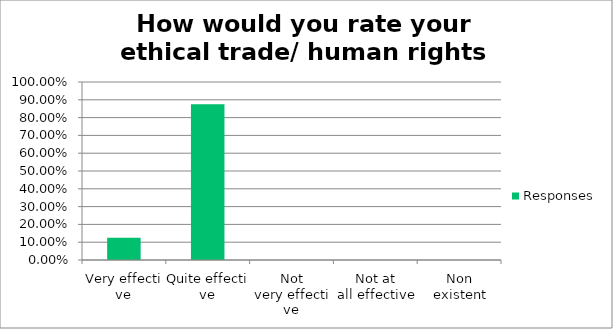
| Category | Responses |
|---|---|
| Very effective | 0.125 |
| Quite effective | 0.875 |
| Not very effective | 0 |
| Not at all effective | 0 |
| Non existent | 0 |